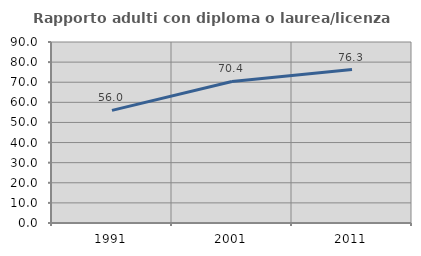
| Category | Rapporto adulti con diploma o laurea/licenza media  |
|---|---|
| 1991.0 | 55.99 |
| 2001.0 | 70.364 |
| 2011.0 | 76.32 |